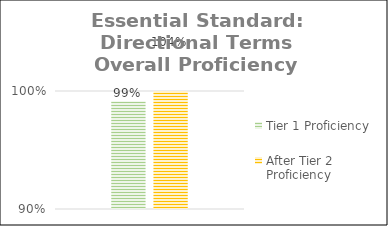
| Category | Tier 1 Proficiency | After Tier 2 Proficiency |
|---|---|---|
| 0 | 0.991 | 1.035 |